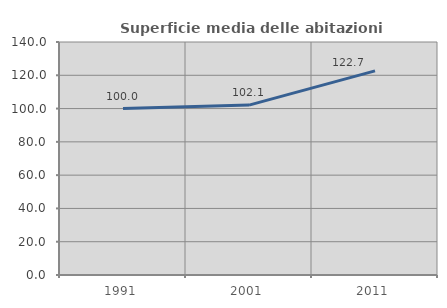
| Category | Superficie media delle abitazioni occupate |
|---|---|
| 1991.0 | 100.012 |
| 2001.0 | 102.083 |
| 2011.0 | 122.676 |